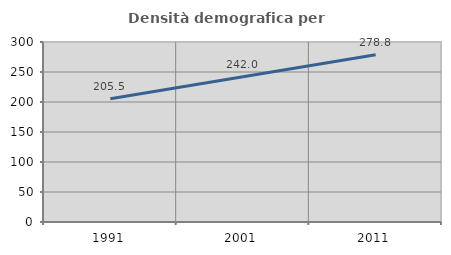
| Category | Densità demografica |
|---|---|
| 1991.0 | 205.48 |
| 2001.0 | 241.954 |
| 2011.0 | 278.774 |